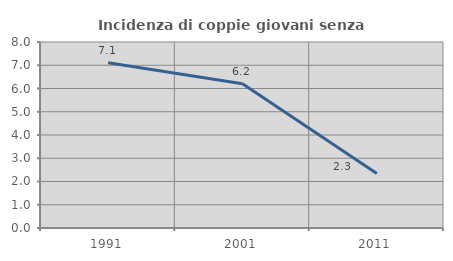
| Category | Incidenza di coppie giovani senza figli |
|---|---|
| 1991.0 | 7.107 |
| 2001.0 | 6.205 |
| 2011.0 | 2.342 |